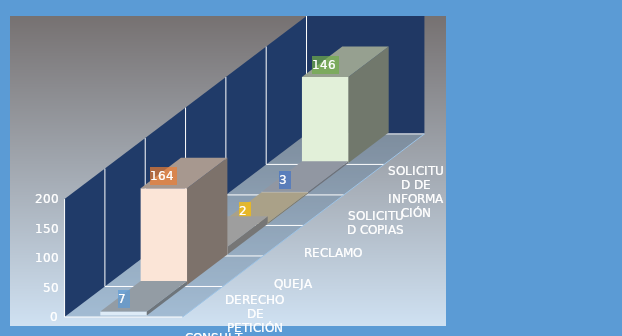
| Category | CONSULTAS | DERECHO DE PETICIÓN | QUEJA | RECLAMO | SOLICITUD COPIAS | SOLICITUD DE INFORMACIÓN |
|---|---|---|---|---|---|---|
| CANTIDAD | 7 | 164 | 13 | 2 | 3 | 146 |